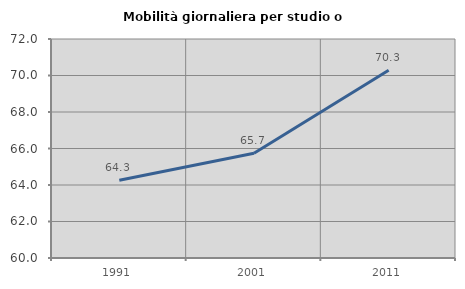
| Category | Mobilità giornaliera per studio o lavoro |
|---|---|
| 1991.0 | 64.261 |
| 2001.0 | 65.737 |
| 2011.0 | 70.284 |